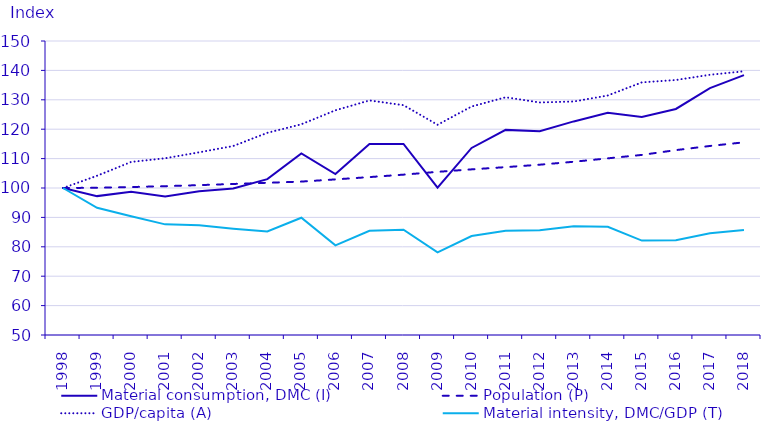
| Category | Material consumption, DMC (I) | Population (P) | GDP/capita (A) | Material intensity, DMC/GDP (T) |
|---|---|---|---|---|
| 1998.0 | 100 | 100 | 100 | 100 |
| 1999.0 | 97.241 | 100.08 | 104.164 | 93.279 |
| 2000.0 | 98.687 | 100.322 | 108.866 | 90.36 |
| 2001.0 | 97.091 | 100.619 | 110.117 | 87.628 |
| 2002.0 | 98.892 | 100.977 | 112.138 | 87.335 |
| 2003.0 | 99.823 | 101.37 | 114.282 | 86.167 |
| 2004.0 | 103.025 | 101.774 | 118.766 | 85.234 |
| 2005.0 | 111.765 | 102.185 | 121.67 | 89.895 |
| 2006.0 | 104.734 | 102.924 | 126.428 | 80.487 |
| 2007.0 | 114.994 | 103.711 | 129.784 | 85.433 |
| 2008.0 | 114.987 | 104.54 | 128.175 | 85.814 |
| 2009.0 | 100.135 | 105.493 | 121.505 | 78.121 |
| 2010.0 | 113.619 | 106.339 | 127.713 | 83.661 |
| 2011.0 | 119.768 | 107.099 | 130.859 | 85.458 |
| 2012.0 | 119.331 | 107.923 | 129.095 | 85.65 |
| 2013.0 | 122.65 | 108.928 | 129.423 | 86.999 |
| 2014.0 | 125.596 | 110.086 | 131.466 | 86.782 |
| 2015.0 | 124.168 | 111.257 | 135.922 | 82.11 |
| 2016.0 | 126.883 | 112.884 | 136.736 | 82.203 |
| 2017.0 | 133.983 | 114.297 | 138.514 | 84.629 |
| 2018.0 | 138.379 | 115.539 | 139.697 | 85.734 |